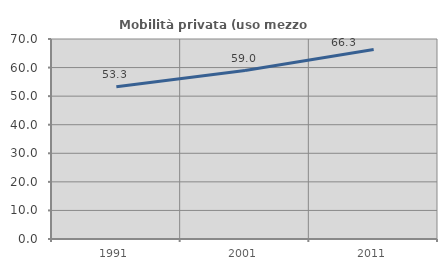
| Category | Mobilità privata (uso mezzo privato) |
|---|---|
| 1991.0 | 53.275 |
| 2001.0 | 58.974 |
| 2011.0 | 66.298 |